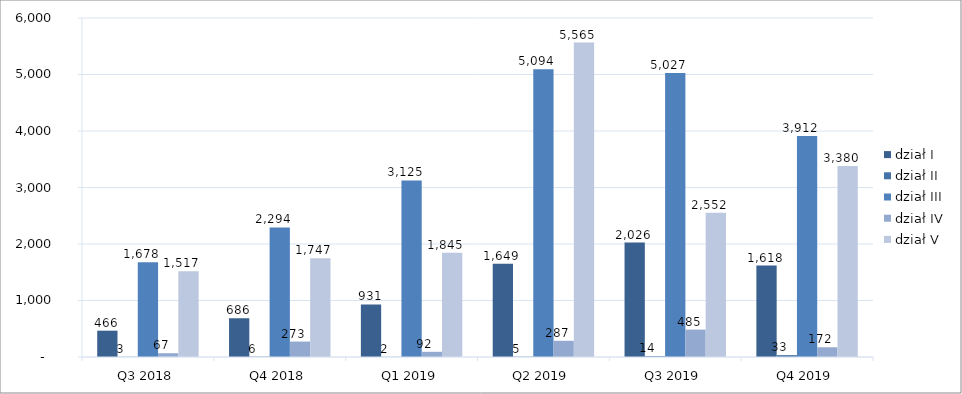
| Category | dział I | dział II | dział III | dział IV | dział V |
|---|---|---|---|---|---|
| Q3 2018 | 466 | 3 | 1678 | 67 | 1517 |
| Q4 2018 | 686 | 6 | 2294 | 273 | 1747 |
| Q1 2019 | 931 | 2 | 3125 | 92 | 1845 |
| Q2 2019 | 1649 | 5 | 5094 | 287 | 5565 |
| Q3 2019 | 2026 | 14 | 5027 | 485 | 2552 |
| Q4 2019 | 1618 | 33 | 3912 | 172 | 3380 |